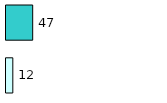
| Category | Series 0 | Series 1 |
|---|---|---|
| 0 | 12 | 47 |